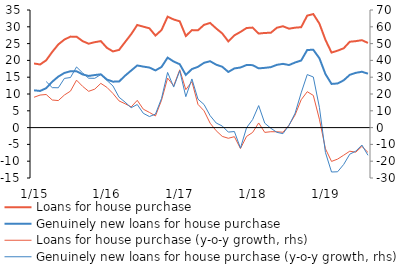
| Category | Loans for house purchase | Genuinely new loans for house purchase |
|---|---|---|
|  1/15 | 19.084 | 11.095 |
| 2 | 18.787 | 10.905 |
| 3 | 20.029 | 11.729 |
| 4 | 22.529 | 13.661 |
| 5 | 24.752 | 15.182 |
| 6 | 26.195 | 16.267 |
| 7 | 27.076 | 16.771 |
| 8 | 27.066 | 16.781 |
| 9 | 25.73 | 15.828 |
| 10 | 24.967 | 15.375 |
| 11 | 25.42 | 15.639 |
| 12 | 25.743 | 15.861 |
|  1/16 | 23.745 | 14.299 |
| 2 | 22.673 | 13.678 |
| 3 | 23.115 | 13.704 |
| 4 | 25.469 | 15.456 |
| 5 | 27.807 | 16.98 |
| 6 | 30.54 | 18.499 |
| 7 | 30.042 | 18.154 |
| 8 | 29.555 | 17.875 |
| 9 | 27.388 | 17.023 |
| 10 | 29.036 | 18.044 |
| 11 | 33.011 | 20.829 |
| 12 | 32.18 | 19.665 |
|  1/17 | 31.63 | 18.86 |
| 2 | 27.255 | 15.667 |
| 3 | 29.015 | 17.424 |
| 4 | 28.955 | 18.083 |
| 5 | 30.579 | 19.281 |
| 6 | 31.145 | 19.759 |
| 7 | 29.509 | 18.73 |
| 8 | 28.03 | 18.11 |
| 9 | 25.655 | 16.561 |
| 10 | 27.462 | 17.612 |
| 11 | 28.474 | 17.888 |
| 12 | 29.638 | 18.625 |
|  1/18 | 29.767 | 18.587 |
| 2 | 27.982 | 17.635 |
| 3 | 28.173 | 17.779 |
| 4 | 28.224 | 17.994 |
| 5 | 29.726 | 18.68 |
| 6 | 30.168 | 18.974 |
| 7 | 29.437 | 18.624 |
| 8 | 29.74 | 19.378 |
| 9 | 29.882 | 19.973 |
| 10 | 33.339 | 23.116 |
| 11 | 33.777 | 23.15 |
| 12 | 30.953 | 20.646 |
|  1/19 | 26.1 | 15.915 |
| 2 | 22.327 | 12.995 |
| 3 | 22.899 | 13.133 |
| 4 | 23.601 | 14.069 |
| 5 | 25.548 | 15.695 |
| 6 | 25.733 | 16.297 |
| 7 | 26.022 | 16.623 |
| 8 | 25.198 | 16.052 |